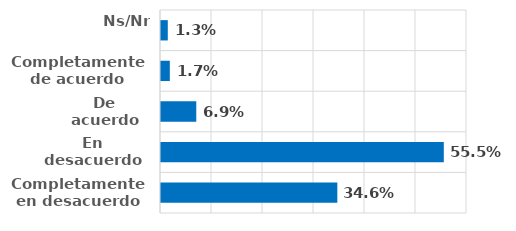
| Category | Series 0 |
|---|---|
| Completamente en desacuerdo | 0.346 |
| En desacuerdo | 0.555 |
| De acuerdo | 0.069 |
| Completamente de acuerdo | 0.017 |
| Ns/Nr | 0.013 |